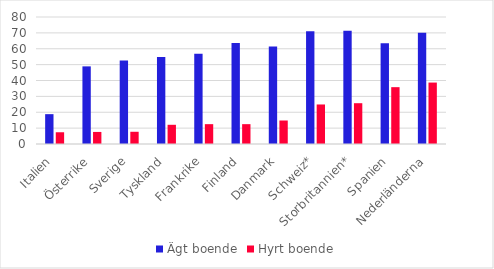
| Category | Ägt boende | Hyrt boende |
|---|---|---|
| Italien | 18.8 | 7.4 |
| Österrike | 48.9 | 7.6 |
| Sverige | 52.6 | 7.7 |
| Tyskland | 54.8 | 12.1 |
| Frankrike | 56.9 | 12.5 |
| Finland | 63.6 | 12.5 |
| Danmark | 61.4 | 14.8 |
| Schweiz* | 71 | 24.9 |
| Storbritannien* | 71.4 | 25.7 |
| Spanien | 63.4 | 35.8 |
| Nederländerna | 70.1 | 38.7 |